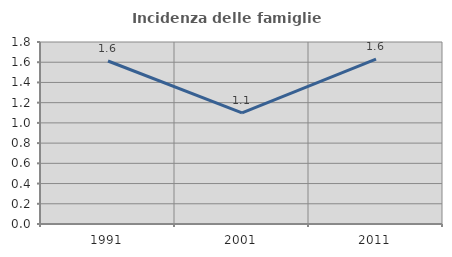
| Category | Incidenza delle famiglie numerose |
|---|---|
| 1991.0 | 1.612 |
| 2001.0 | 1.098 |
| 2011.0 | 1.63 |